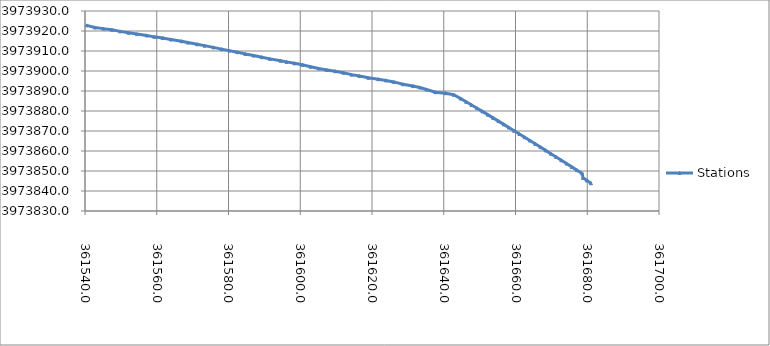
| Category | Stations |
|---|---|
| 361540.4386 | 3973922.827 |
| 361542.7791 | 3973921.723 |
| 361545.1246 | 3973921.183 |
| 361547.4701 | 3973920.643 |
| 361549.8131 | 3973919.821 |
| 361552.1574 | 3973919.14 |
| 361554.5016 | 3973918.459 |
| 361557.2037 | 3973917.793 |
| 361559.318 | 3973917.072 |
| 361561.6449 | 3973916.509 |
| 361563.9349 | 3973915.76 |
| 361566.9258 | 3973914.879 |
| 361568.6952 | 3973914.205 |
| 361571.2523 | 3973913.373 |
| 361573.3374 | 3973912.687 |
| 361575.7918 | 3973911.806 |
| 361578.0533 | 3973910.941 |
| 361580.228 | 3973910.19 |
| 361582.464 | 3973909.421 |
| 361584.7079 | 3973908.477 |
| 361587.0142 | 3973907.721 |
| 361589.3064 | 3973906.921 |
| 361591.5596 | 3973906.055 |
| 361594.5266 | 3973905.138 |
| 361596.1714 | 3973904.555 |
| 361598.3764 | 3973903.833 |
| 361600.577 | 3973903.079 |
| 361602.8672 | 3973902.166 |
| 361605.1681 | 3973901.239 |
| 361607.4175 | 3973900.548 |
| 361609.7544 | 3973899.895 |
| 361612.0528 | 3973899.105 |
| 361614.3276 | 3973898.176 |
| 361616.5006 | 3973897.512 |
| 361619.0011 | 3973896.597 |
| 361621.7335 | 3973895.908 |
| 361623.9181 | 3973895.291 |
| 361626.102 | 3973894.543 |
| 361628.5957 | 3973893.398 |
| 361631.4334 | 3973892.459 |
| 361633.348 | 3973891.773 |
| 361635.1997 | 3973890.728 |
| 361637.6863 | 3973889.398 |
| 361640.5125 | 3973888.919 |
| 361642.7512 | 3973888.118 |
| 361644.73 | 3973886.198 |
| 361646.2476 | 3973884.605 |
| 361647.7595 | 3973883.006 |
| 361649.266 | 3973881.402 |
| 361650.7686 | 3973879.795 |
| 361652.263 | 3973878.18 |
| 361653.7566 | 3973876.564 |
| 361655.2431 | 3973874.942 |
| 361656.7277 | 3973873.318 |
| 361658.1278 | 3973871.779 |
| 361659.6049 | 3973870.148 |
| 361661.0784 | 3973868.514 |
| 361662.5485 | 3973866.877 |
| 361664.0162 | 3973865.238 |
| 361665.4805 | 3973863.595 |
| 361666.9427 | 3973861.951 |
| 361668.4049 | 3973860.307 |
| 361669.8633 | 3973858.659 |
| 361671.3205 | 3973857.011 |
| 361672.7762 | 3973855.361 |
| 361674.231 | 3973853.71 |
| 361675.6847 | 3973852.058 |
| 361677.1378 | 3973850.406 |
| 361678.59 | 3973848.753 |
| 361678.81 | 3973846.578 |
| 361679.925 | 3973845.222 |
| 361681.04 | 3973843.866 |